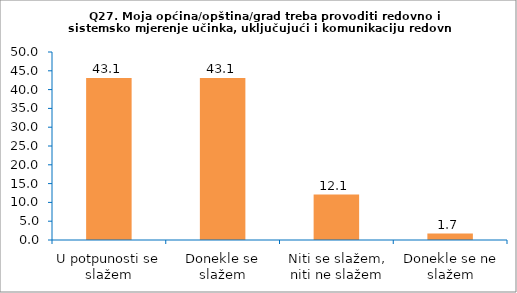
| Category | Series 0 |
|---|---|
| U potpunosti se slažem | 43.103 |
| Donekle se slažem | 43.103 |
| Niti se slažem, niti ne slažem | 12.069 |
| Donekle se ne slažem | 1.724 |